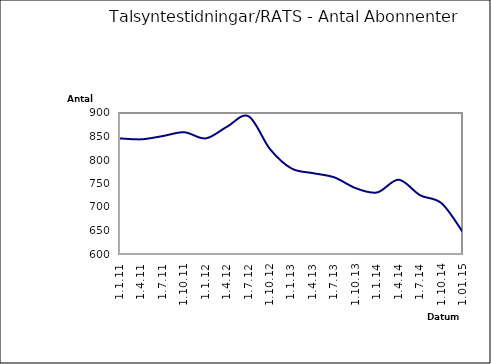
| Category | Series 0 |
|---|---|
| 1.1.11 | 846 |
| 1.4.11 | 844 |
| 1.7.11 | 851 |
| 1.10.11 | 859 |
| 1.1.12 | 846 |
| 1.4.12 | 871 |
| 1.7.12 | 893 |
| 1.10.12 | 823 |
| 1.1.13 | 782 |
| 1.4.13 | 772 |
| 1.7.13 | 763 |
| 1.10.13 | 740 |
| 1.1.14 | 731 |
| 1.4.14 | 758 |
| 1.7.14 | 725 |
| 1.10.14 | 708 |
| 1.01.15 | 646 |